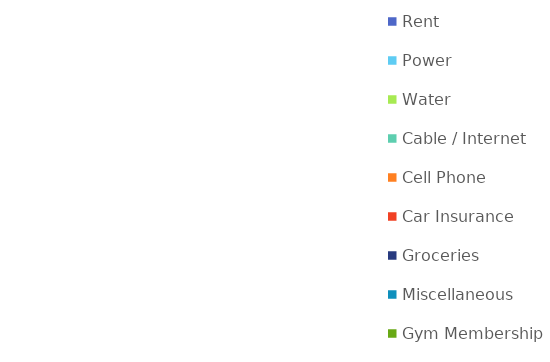
| Category | Series 0 |
|---|---|
| Rent | 0 |
| Power | 0 |
| Water | 0 |
| Cable / Internet | 0 |
| Cell Phone | 0 |
| Car Insurance | 0 |
| Groceries | 0 |
| Miscellaneous | 0 |
| Gym Membership | 0 |